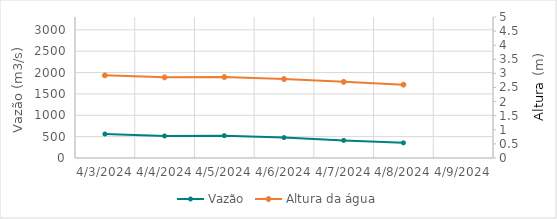
| Category | Vazão |
|---|---|
| 10/30/23 | 109.06 |
| 10/29/23 | 111.37 |
| 10/28/23 | 113.81 |
| 10/27/23 | 116.24 |
| 10/26/23 | 119.64 |
| 10/25/23 | 122.74 |
| 10/24/23 | 127.93 |